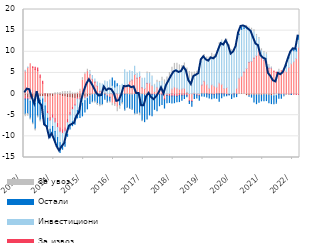
| Category | По трансакционим рачунима | За ликвидност и обртна средства  | За извоз | Инвестициони | Остали | За увоз |
|---|---|---|---|---|---|---|
| 2013-01-01 | -0.509 | 5.466 | -0.655 | 0.157 | -3.557 | -0.62 |
| 2013-02-01 | -0.821 | 6.307 | -0.351 | 0.101 | -3.442 | -0.636 |
| 2013-03-01 | -0.908 | 7.144 | -0.174 | -0.604 | -3.955 | -0.473 |
| 2013-04-01 | -0.906 | 6.265 | 0.188 | -0.805 | -5.11 | -0.441 |
| 2013-05-01 | -1.028 | 5.791 | 0.566 | -1.205 | -5.942 | -0.539 |
| 2013-06-01 | -0.715 | 5.566 | 0.59 | -0.246 | -4.209 | -0.467 |
| 2013-07-01 | -0.656 | 3.962 | 0.527 | -0.788 | -4.619 | -0.522 |
| 2013-08-01 | -0.571 | 2.543 | 0.475 | -0.574 | -4.455 | -0.211 |
| 2013-09-01 | -0.597 | -1.463 | 0.046 | -0.788 | -4.325 | -0.17 |
| 2013-10-01 | -0.731 | -3.405 | -0.479 | -1.101 | -1.998 | -0.034 |
| 2013-11-01 | -0.534 | -5.012 | -0.697 | -2.071 | -1.999 | 0.032 |
| 2013-12-01 | -0.631 | -4.25 | -0.793 | -2 | -1.812 | 0.042 |
| 2014-01-01 | -0.248 | -5.468 | -0.921 | -2.223 | -2.314 | 0.338 |
| 2014-02-01 | -0.244 | -6.677 | -0.967 | -2.397 | -2.478 | 0.345 |
| 2014-03-01 | -0.312 | -7.664 | -0.914 | -2.634 | -2.299 | 0.368 |
| 2014-04-01 | -0.598 | -7.82 | -0.878 | -2.779 | -0.977 | 0.561 |
| 2014-05-01 | -0.678 | -7.271 | -0.835 | -2.63 | -0.953 | 0.634 |
| 2014-06-01 | -0.89 | -5.133 | -0.763 | -2.735 | -0.458 | 0.61 |
| 2014-07-01 | -0.861 | -3.427 | -0.672 | -2.518 | -0.758 | 0.681 |
| 2014-08-01 | -1.004 | -2.174 | -0.467 | -2.918 | -0.917 | 0.276 |
| 2014-09-01 | -1.021 | -1.308 | -0.375 | -3.018 | -1.426 | 0.243 |
| 2014-10-01 | -0.819 | 0.161 | -0.34 | -2.752 | -1.718 | 0.247 |
| 2014-11-01 | -0.858 | 0.695 | -0.279 | -2.093 | -2.317 | 0.459 |
| 2014-12-01 | -0.577 | 3.263 | -0.264 | -1.35 | -2.967 | 0.625 |
| 2015-01-01 | -0.712 | 4.673 | -0.142 | -0.704 | -2.68 | 0.34 |
| 2015-02-01 | -0.565 | 5.321 | -0.111 | -0.407 | -2.409 | 0.553 |
| 2015-03-01 | -0.434 | 4.59 | 0.008 | 0.669 | -1.773 | 0.324 |
| 2015-04-01 | -0.175 | 3.498 | 0.044 | 0.845 | -1.638 | -0.132 |
| 2015-05-01 | -0.054 | 2.82 | 0.068 | 0.654 | -1.651 | -0.488 |
| 2015-06-01 | 0.05 | 1.84 | 0.063 | 0.904 | -2.258 | -0.459 |
| 2015-07-01 | 0.129 | 0.502 | 0.07 | 1.849 | -2.403 | -0.592 |
| 2015-08-01 | 0.104 | 0.009 | -0.067 | 2.291 | -2.376 | -0.307 |
| 2015-09-01 | 0.112 | 0.208 | -0.055 | 2.751 | -1.148 | -0.214 |
| 2015-10-01 | 0.038 | -0.411 | -0.06 | 2.883 | -1.421 | -0.215 |
| 2015-11-01 | 0.131 | -0.703 | -0.076 | 3.2 | -0.895 | -0.44 |
| 2015-12-01 | 0.06 | -2.198 | 0.008 | 2.045 | 1.664 | -0.542 |
| 2016-01-01 | 0.112 | -2.269 | -0.03 | 1.566 | 1.404 | -0.65 |
| 2016-02-01 | 0.086 | -3.097 | 0.005 | 1.894 | 0.462 | -1.069 |
| 2016-03-01 | 0.054 | -1.187 | -0.022 | 1.97 | -1.494 | -0.878 |
| 2016-04-01 | 0.002 | 0.259 | -0.024 | 2.055 | -1.952 | -0.542 |
| 2016-05-01 | -0.049 | 2.232 | -0.014 | 3.525 | -3.719 | -0.201 |
| 2016-06-01 | -0.049 | 2.038 | 0.004 | 3.11 | -3.101 | -0.262 |
| 2016-07-01 | -0.188 | 3.046 | 0.004 | 2.456 | -3.237 | -0.159 |
| 2016-08-01 | -0.222 | 3.353 | 0.003 | 1.994 | -3.361 | -0.259 |
| 2016-09-01 | -0.107 | 4.637 | 0.003 | 1.923 | -4.549 | -0.209 |
| 2016-10-01 | -0.069 | 3.752 | 0.02 | 1.099 | -4.471 | -0.197 |
| 2016-11-01 | 0.003 | 4.032 | 0.118 | 1.076 | -4.499 | -0.6 |
| 2016-12-01 | -0.126 | 1.493 | 0.07 | 2.199 | -6.059 | -0.332 |
| 2017-01-01 | -0.287 | 1.255 | 0.034 | 2.468 | -6.239 | 0.016 |
| 2017-02-01 | -0.028 | 2.502 | 0.033 | 2.337 | -5.845 | 0.328 |
| 2017-03-01 | -0.212 | 2.639 | -0.061 | 2.218 | -4.66 | 0.242 |
| 2017-04-01 | 0.006 | 1.986 | -0.118 | 2.178 | -5.005 | 0.123 |
| 2017-05-01 | -0.021 | 0.622 | -0.131 | 1.488 | -3.457 | 0.202 |
| 2017-06-01 | -0.058 | 1.637 | -0.146 | 1.1 | -3.715 | 0.504 |
| 2017-07-01 | 0.066 | 0.742 | -0.146 | 1.936 | -2.615 | 0.257 |
| 2017-08-01 | 0.095 | 1.091 | -0.147 | 1.891 | -2.348 | 0.891 |
| 2017-09-01 | -0.033 | -1.003 | -0.338 | 2.229 | -1.931 | 1.128 |
| 2017-10-01 | 0.035 | -0.002 | -0.349 | 2.95 | -1.675 | 1.076 |
| 2017-11-01 | -0.038 | 0.191 | -0.423 | 3.298 | -1.519 | 1.614 |
| 2017-12-01 | 0.111 | 1.115 | -0.472 | 3.68 | -1.636 | 1.452 |
| 2018-01-01 | -0.017 | 1.678 | -0.449 | 4.093 | -1.582 | 1.485 |
| 2018-02-01 | -0.076 | 1.395 | -0.446 | 4.432 | -1.275 | 1.464 |
| 2018-03-01 | 0.181 | 0.968 | -0.353 | 4.465 | -1.426 | 1.286 |
| 2018-04-01 | 0.071 | 1.103 | -0.297 | 4.181 | -1.141 | 1.381 |
| 2018-05-01 | 0.137 | 1.251 | -0.296 | 4.4 | -0.726 | 1.574 |
| 2018-06-01 | 0.284 | 0.134 | -0.277 | 4.559 | -0.377 | 1.191 |
| 2018-07-01 | 0.145 | -1.444 | -0.282 | 3.523 | -0.476 | 1.691 |
| 2018-08-01 | 0.047 | -1.482 | -0.277 | 3.826 | -1.138 | 1.281 |
| 2018-09-01 | 0.187 | 0.07 | -0.088 | 3.999 | -0.981 | 0.962 |
| 2018-10-01 | 0.165 | -0.154 | -0.086 | 4.312 | -0.67 | 0.902 |
| 2018-11-01 | 0.151 | -0.294 | -0.083 | 5.778 | -1.1 | 0.383 |
| 2018-12-01 | 0.121 | 2.002 | 0.005 | 5.72 | -0.449 | 0.69 |
| 2019-01-01 | 0.084 | 2.964 | 0.003 | 5.799 | -0.532 | 0.511 |
| 2019-02-01 | 0.122 | 2.071 | -0.001 | 6.112 | -0.71 | 0.483 |
| 2019-03-01 | -0.043 | 1.384 | -0.007 | 6.432 | -0.89 | 0.926 |
| 2019-04-01 | -0.017 | 2.209 | -0.007 | 6.458 | -1.061 | 0.975 |
| 2019-05-01 | -0.065 | 1.864 | -0.007 | 6.82 | -0.881 | 0.597 |
| 2019-06-01 | 0.071 | 1.52 | -0.011 | 7.649 | -0.954 | 0.599 |
| 2019-07-01 | 0.174 | 2.439 | -0.011 | 8.965 | -1.672 | 0.577 |
| 2019-08-01 | 0.114 | 2.222 | -0.011 | 10.233 | -0.877 | 0.238 |
| 2019-09-01 | 0.013 | 1.329 | -0.011 | 10.479 | -0.423 | 0.206 |
| 2019-10-31 | -0.066 | 1.541 | -0.01 | 11.047 | -0.342 | 0.436 |
| 2019-11-30 | -0.091 | 0.084 | -0.01 | 10.759 | -0.137 | 0.843 |
| 2019-12-31 | -0.112 | -0.022 | -0.01 | 10.098 | -0.896 | 0.408 |
| 2020-01-31 | 0.054 | 0.141 | -0.01 | 9.923 | -0.677 | 0.532 |
| 2020-02-29 | -0.038 | 1.384 | -0.005 | 9.987 | -0.557 | 0.483 |
| 2020-03-31 | 0.142 | 3.609 | 0 | 10.341 | 0.142 | 0.224 |
| 2020-04-30 | 0.16 | 4.087 | 0 | 11.041 | 0.559 | 0.149 |
| 2020-05-31 | -0.034 | 5.187 | 0.005 | 10.338 | 0.308 | 0.306 |
| 2020-06-30 | -0.38 | 6.042 | 0.022 | 9.534 | 0.223 | 0.414 |
| 2020-07-31 | -0.388 | 7.439 | 0.076 | 8.138 | -0.127 | 0.2 |
| 2020-08-31 | -0.211 | 7.694 | 0.075 | 7.348 | -0.512 | 0.459 |
| 2020-09-30 | -0.276 | 8.456 | 0.072 | 6.174 | -1.624 | 0.508 |
| 2020-10-31 | -0.209 | 9.015 | 0.061 | 4.618 | -2.062 | 0.415 |
| 2020-11-30 | -0.198 | 10.255 | 0.062 | 2.65 | -1.729 | 0.415 |
| 2020-12-31 | -0.289 | 8.536 | 0.053 | 1.68 | -1.31 | 0.431 |
| 2021-01-31 | -0.187 | 7.94 | 0.055 | 1.703 | -1.365 | 0.346 |
| 2021-02-28 | -0.182 | 7.661 | 0.056 | 1.682 | -1.362 | 0.377 |
| 2021-03-31 | -0.281 | 6.083 | 0.055 | 0.556 | -1.747 | 0.244 |
| 2021-04-30 | -0.375 | 6.105 | 0.054 | 0.086 | -1.882 | 0.156 |
| 2021-05-31 | -0.223 | 5.378 | 0.046 | -0.24 | -1.845 | 0.022 |
| 2021-06-30 | -0.026 | 5.122 | 0.027 | -0.347 | -1.77 | -0.125 |
| 2021-07-31 | 0.057 | 5.265 | -0.031 | 0.268 | -0.942 | 0.254 |
| 2021-08-31 | -0.054 | 5.553 | -0.031 | -0.057 | -0.871 | 0.039 |
| 2021-09-30 | 0.036 | 5.736 | -0.031 | -0.192 | -0.163 | -0.249 |
| 2021-10-31 | -0.052 | 5.342 | -0.023 | 1.371 | 0.155 | -0.245 |
| 2021-11-30 | -0.072 | 6.255 | -0.029 | 2.305 | 0.099 | -0.209 |
| 2021-12-31 | 0.06 | 7.12 | -0.041 | 2.857 | -0.066 | 0.018 |
| 2022-01-31 | -0.021 | 7.65 | -0.05 | 2.573 | 0.52 | 0.027 |
| 2022-02-28 | -0.051 | 8.407 | -0.051 | 1.769 | 0.543 | -0.012 |
| 2022-03-31 | -0.028 | 11.055 | -0.052 | 1.926 | 0.884 | 0.143 |